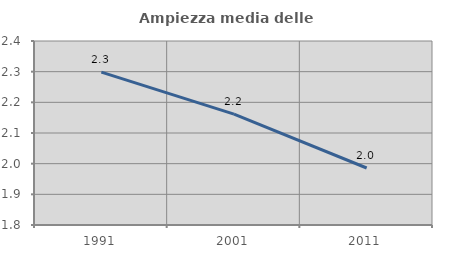
| Category | Ampiezza media delle famiglie |
|---|---|
| 1991.0 | 2.299 |
| 2001.0 | 2.162 |
| 2011.0 | 1.986 |